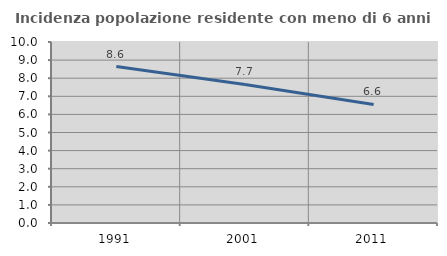
| Category | Incidenza popolazione residente con meno di 6 anni |
|---|---|
| 1991.0 | 8.646 |
| 2001.0 | 7.658 |
| 2011.0 | 6.552 |